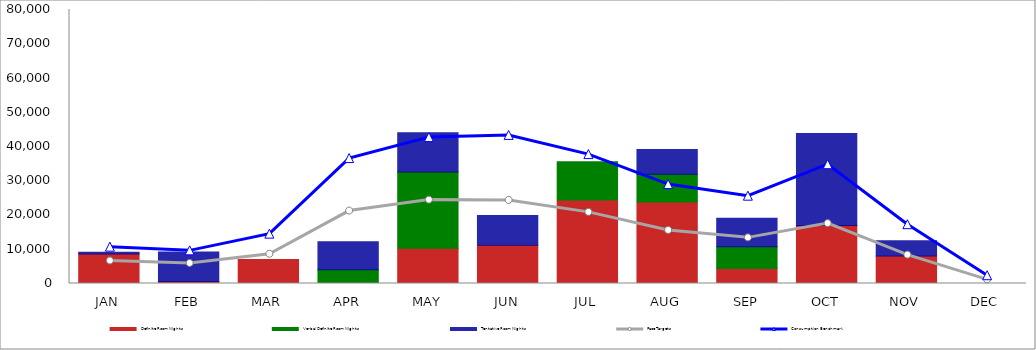
| Category | Definite Room Nights | Verbal Definite Room Nights | Tentative Room Nights |
|---|---|---|---|
| JAN | 8643 | 0 | 481 |
| FEB | 598 | 0 | 8593 |
| MAR | 7030 | 0 | 0 |
| APR | 0 | 4000 | 8189 |
| MAY | 10290 | 22287 | 11455 |
| JUN | 11200 | 0 | 8671 |
| JUL | 24369 | 11160 | 0 |
| AUG | 23774 | 8095 | 7274 |
| SEP | 4354 | 6400 | 8265 |
| OCT | 16919 | 0 | 26861 |
| NOV | 8012 | 0 | 4489 |
| DEC | 0 | 0 | 0 |